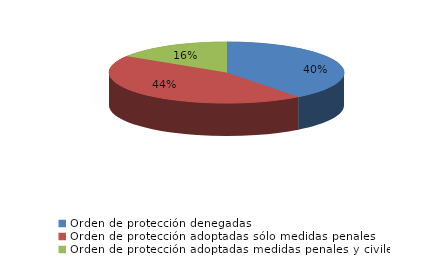
| Category | Series 0 |
|---|---|
| Orden de protección denegadas | 89 |
| Orden de protección adoptadas sólo medidas penales | 100 |
| Orden de protección adoptadas medidas penales y civiles | 36 |